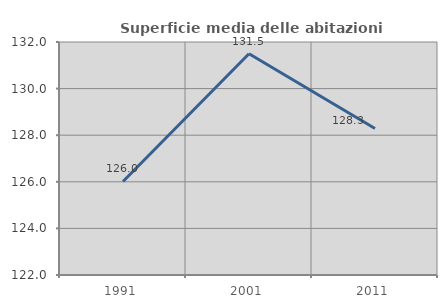
| Category | Superficie media delle abitazioni occupate |
|---|---|
| 1991.0 | 126.016 |
| 2001.0 | 131.493 |
| 2011.0 | 128.291 |